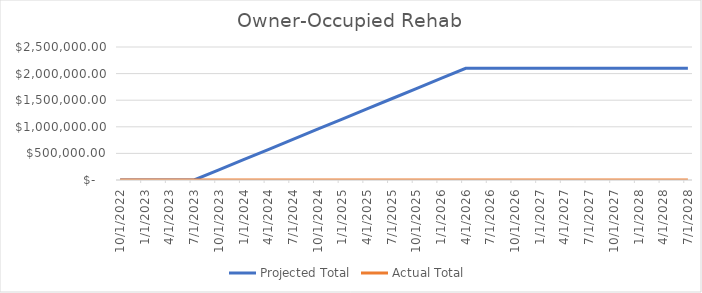
| Category | Projected Total | Actual Total  |
|---|---|---|
| 10/1/22 | 0 | 0 |
| 1/1/23 | 0 | 0 |
| 4/1/23 | 0 | 0 |
| 7/1/23 | 0 | 0 |
| 10/1/23 | 190909.091 | 0 |
| 1/1/24 | 381818.182 | 0 |
| 4/1/24 | 572727.273 | 0 |
| 7/1/24 | 763636.364 | 0 |
| 10/1/24 | 954545.455 | 0 |
| 1/1/25 | 1145454.545 | 0 |
| 4/1/25 | 1336363.636 | 0 |
| 7/1/25 | 1527272.727 | 0 |
| 10/1/25 | 1718181.818 | 0 |
| 1/1/26 | 1909090.909 | 0 |
| 4/1/26 | 2100000 | 0 |
| 7/1/26 | 2100000 | 0 |
| 10/1/26 | 2100000 | 0 |
| 1/1/27 | 2100000 | 0 |
| 4/1/27 | 2100000 | 0 |
| 7/1/27 | 2100000 | 0 |
| 10/1/27 | 2100000 | 0 |
| 1/1/28 | 2100000 | 0 |
| 4/1/28 | 2100000 | 0 |
| 7/1/28 | 2100000 | 0 |